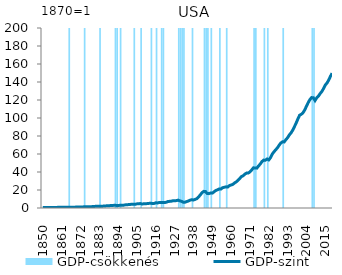
| Category | GDP-csökkenés |
|---|---|
| 1850.0 | 0 |
| 1851.0 | 0 |
| 1852.0 | 0 |
| 1853.0 | 0 |
| 1854.0 | 0 |
| 1855.0 | 0 |
| 1856.0 | 0 |
| 1857.0 | 0 |
| 1858.0 | 0 |
| 1859.0 | 0 |
| 1860.0 | 0 |
| 1861.0 | 0 |
| 1862.0 | 0 |
| 1863.0 | 0 |
| 1864.0 | 0 |
| 1865.0 | 0 |
| 1866.0 | 200 |
| 1867.0 | 0 |
| 1868.0 | 0 |
| 1869.0 | 0 |
| 1870.0 | 0 |
| 1871.0 | 0 |
| 1872.0 | 0 |
| 1873.0 | 0 |
| 1874.0 | 0 |
| 1875.0 | 200 |
| 1876.0 | 0 |
| 1877.0 | 0 |
| 1878.0 | 0 |
| 1879.0 | 0 |
| 1880.0 | 0 |
| 1881.0 | 0 |
| 1882.0 | 0 |
| 1883.0 | 0 |
| 1884.0 | 200 |
| 1885.0 | 0 |
| 1886.0 | 0 |
| 1887.0 | 0 |
| 1888.0 | 0 |
| 1889.0 | 0 |
| 1890.0 | 0 |
| 1891.0 | 0 |
| 1892.0 | 0 |
| 1893.0 | 200 |
| 1894.0 | 200 |
| 1895.0 | 0 |
| 1896.0 | 200 |
| 1897.0 | 0 |
| 1898.0 | 0 |
| 1899.0 | 0 |
| 1900.0 | 0 |
| 1901.0 | 0 |
| 1902.0 | 0 |
| 1903.0 | 0 |
| 1904.0 | 200 |
| 1905.0 | 0 |
| 1906.0 | 0 |
| 1907.0 | 0 |
| 1908.0 | 200 |
| 1909.0 | 0 |
| 1910.0 | 0 |
| 1911.0 | 0 |
| 1912.0 | 0 |
| 1913.0 | 0 |
| 1914.0 | 200 |
| 1915.0 | 0 |
| 1916.0 | 0 |
| 1917.0 | 200 |
| 1918.0 | 0 |
| 1919.0 | 0 |
| 1920.0 | 200 |
| 1921.0 | 200 |
| 1922.0 | 0 |
| 1923.0 | 0 |
| 1924.0 | 0 |
| 1925.0 | 0 |
| 1926.0 | 0 |
| 1927.0 | 0 |
| 1928.0 | 0 |
| 1929.0 | 0 |
| 1930.0 | 200 |
| 1931.0 | 200 |
| 1932.0 | 200 |
| 1933.0 | 200 |
| 1934.0 | 0 |
| 1935.0 | 0 |
| 1936.0 | 0 |
| 1937.0 | 0 |
| 1938.0 | 200 |
| 1939.0 | 0 |
| 1940.0 | 0 |
| 1941.0 | 0 |
| 1942.0 | 0 |
| 1943.0 | 0 |
| 1944.0 | 0 |
| 1945.0 | 200 |
| 1946.0 | 200 |
| 1947.0 | 200 |
| 1948.0 | 0 |
| 1949.0 | 200 |
| 1950.0 | 0 |
| 1951.0 | 0 |
| 1952.0 | 0 |
| 1953.0 | 0 |
| 1954.0 | 200 |
| 1955.0 | 0 |
| 1956.0 | 0 |
| 1957.0 | 0 |
| 1958.0 | 200 |
| 1959.0 | 0 |
| 1960.0 | 0 |
| 1961.0 | 0 |
| 1962.0 | 0 |
| 1963.0 | 0 |
| 1964.0 | 0 |
| 1965.0 | 0 |
| 1966.0 | 0 |
| 1967.0 | 0 |
| 1968.0 | 0 |
| 1969.0 | 0 |
| 1970.0 | 0 |
| 1971.0 | 0 |
| 1972.0 | 0 |
| 1973.0 | 0 |
| 1974.0 | 200 |
| 1975.0 | 200 |
| 1976.0 | 0 |
| 1977.0 | 0 |
| 1978.0 | 0 |
| 1979.0 | 0 |
| 1980.0 | 200 |
| 1981.0 | 0 |
| 1982.0 | 200 |
| 1983.0 | 0 |
| 1984.0 | 0 |
| 1985.0 | 0 |
| 1986.0 | 0 |
| 1987.0 | 0 |
| 1988.0 | 0 |
| 1989.0 | 0 |
| 1990.0 | 0 |
| 1991.0 | 200 |
| 1992.0 | 0 |
| 1993.0 | 0 |
| 1994.0 | 0 |
| 1995.0 | 0 |
| 1996.0 | 0 |
| 1997.0 | 0 |
| 1998.0 | 0 |
| 1999.0 | 0 |
| 2000.0 | 0 |
| 2001.0 | 0 |
| 2002.0 | 0 |
| 2003.0 | 0 |
| 2004.0 | 0 |
| 2005.0 | 0 |
| 2006.0 | 0 |
| 2007.0 | 0 |
| 2008.0 | 200 |
| 2009.0 | 200 |
| 2010.0 | 0 |
| 2011.0 | 0 |
| 2012.0 | 0 |
| 2013.0 | 0 |
| 2014.0 | 0 |
| 2015.0 | 0 |
| 2016.0 | 0 |
| 2017.0 | 0 |
| 2018.0 | 0 |
| 2019.0 | 0 |